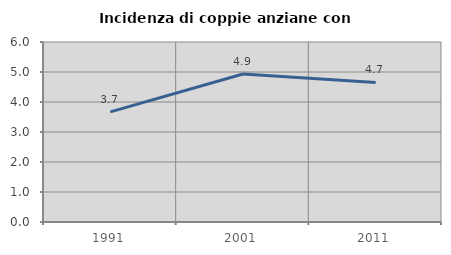
| Category | Incidenza di coppie anziane con figli |
|---|---|
| 1991.0 | 3.671 |
| 2001.0 | 4.934 |
| 2011.0 | 4.653 |